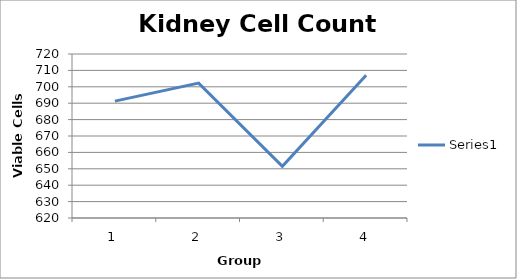
| Category | Series 0 |
|---|---|
| 0 | 691.25 |
| 1 | 702.25 |
| 2 | 651.5 |
| 3 | 707 |